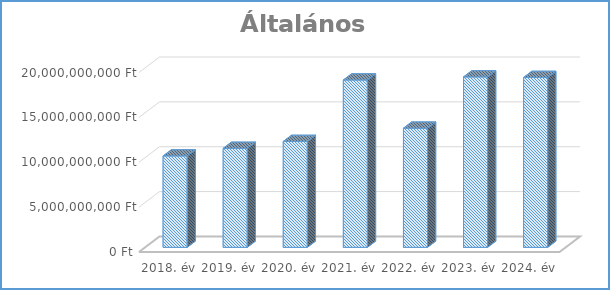
| Category | Általános közszolgáltatások |
|---|---|
| 2018. év | 10187464082 |
| 2019. év | 11033815443 |
| 2020. év | 11805387697 |
| 2021. év | 18651066633 |
| 2022. év | 13280318352 |
| 2023. év | 18994376263 |
| 2024. év | 18936206731 |